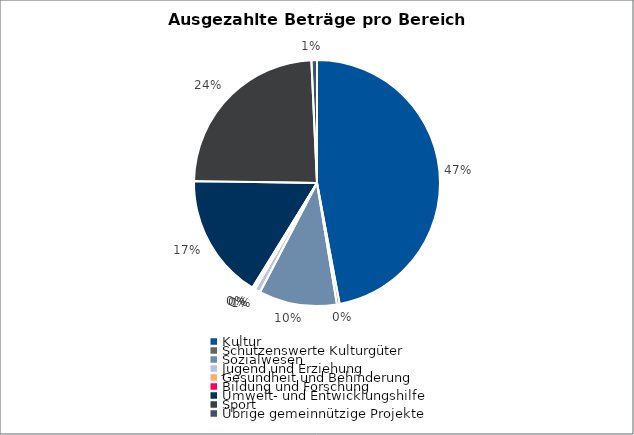
| Category | Series 0 |
|---|---|
| Kultur | 20000000 |
| Schützenswerte Kulturgüter | 150000 |
| Sozialwesen | 4356000 |
| Jugend und Erziehung | 316000 |
| Gesundheit und Behinderung | 50000 |
| Bildung und Forschung | 120000 |
| Umwelt- und Entwicklungshilfe | 7000000 |
| Sport | 10200000 |
| Übrige gemeinnützige Projekte | 310000 |